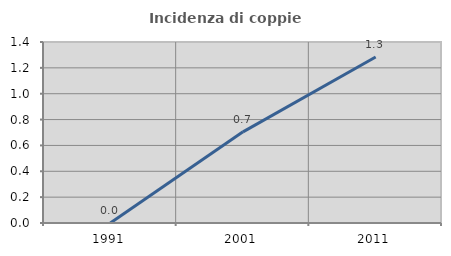
| Category | Incidenza di coppie miste |
|---|---|
| 1991.0 | 0 |
| 2001.0 | 0.705 |
| 2011.0 | 1.284 |